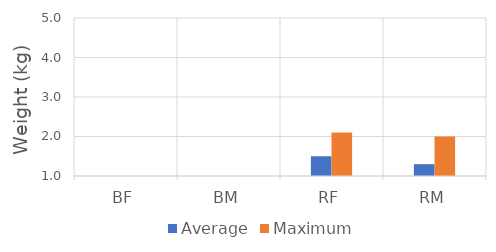
| Category | Average | Maximum |
|---|---|---|
| BF | 0 | 0 |
| BM | 0 | 0 |
| RF | 1.5 | 2.1 |
| RM | 1.3 | 2 |